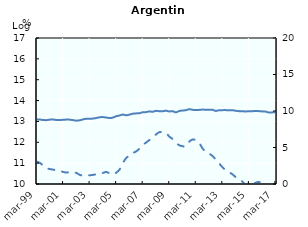
| Category | Tendencia |
|---|---|
| Mar-99 | 13.09 |
| Jun-99 | 13.09 |
| Sep-99 | 13.067 |
| Dec-99 | 13.062 |
| Mar-00 | 13.085 |
| Jun-00 | 13.091 |
| Sep-00 | 13.07 |
| Dec-00 | 13.068 |
| Mar-01 | 13.078 |
| Jun-01 | 13.089 |
| Sep-01 | 13.084 |
| Dec-01 | 13.061 |
| Mar-02 | 13.037 |
| Jun-02 | 13.054 |
| Sep-02 | 13.098 |
| Dec-02 | 13.128 |
| Mar-03 | 13.131 |
| Jun-03 | 13.136 |
| Sep-03 | 13.164 |
| Dec-03 | 13.198 |
| Mar-04 | 13.207 |
| Jun-04 | 13.187 |
| Sep-04 | 13.165 |
| Dec-04 | 13.184 |
| Mar-05 | 13.25 |
| Jun-05 | 13.285 |
| Sep-05 | 13.329 |
| Dec-05 | 13.297 |
| Mar-06 | 13.326 |
| Jun-06 | 13.37 |
| Sep-06 | 13.385 |
| Dec-06 | 13.394 |
| Mar-07 | 13.441 |
| Jun-07 | 13.447 |
| Sep-07 | 13.48 |
| Dec-07 | 13.463 |
| Mar-08 | 13.507 |
| Jun-08 | 13.49 |
| Sep-08 | 13.487 |
| Dec-08 | 13.515 |
| Mar-09 | 13.479 |
| Jun-09 | 13.493 |
| Sep-09 | 13.435 |
| Dec-09 | 13.499 |
| Mar-10 | 13.523 |
| Jun-10 | 13.538 |
| Sep-10 | 13.586 |
| Dec-10 | 13.559 |
| Mar-11 | 13.542 |
| Jun-11 | 13.553 |
| Sep-11 | 13.567 |
| Dec-11 | 13.56 |
| Mar-12 | 13.556 |
| Jun-12 | 13.562 |
| Sep-12 | 13.504 |
| Dec-12 | 13.536 |
| Mar-13 | 13.541 |
| Jun-13 | 13.542 |
| Sep-13 | 13.533 |
| Dec-13 | 13.538 |
| Mar-14 | 13.511 |
| Jun-14 | 13.492 |
| Sep-14 | 13.489 |
| Dec-14 | 13.479 |
| Mar-15 | 13.489 |
| Jun-15 | 13.489 |
| Sep-15 | 13.503 |
| Dec-15 | 13.493 |
| Mar-16 | 13.482 |
| Jun-16 | 13.474 |
| Sep-16 | 13.428 |
| Dec-16 | 13.433 |
| Mar-17 | 13.448 |